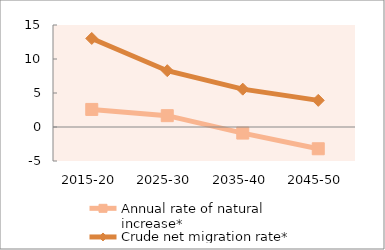
| Category | Annual rate of natural increase* | Crude net migration rate* |
|---|---|---|
| 2015-20 | 2.585 | 13.02 |
| 2025-30 | 1.668 | 8.283 |
| 2035-40 | -0.893 | 5.565 |
| 2045-50 | -3.2 | 3.917 |